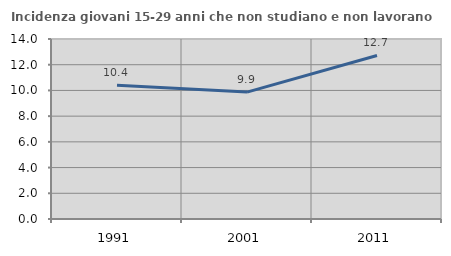
| Category | Incidenza giovani 15-29 anni che non studiano e non lavorano  |
|---|---|
| 1991.0 | 10.394 |
| 2001.0 | 9.868 |
| 2011.0 | 12.717 |